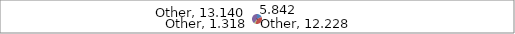
| Category | Series 1 |
|---|---|
| 0 | 5.842 |
| 1 | 12.228 |
| 2 | 1.318 |
| 3 | 13.14 |